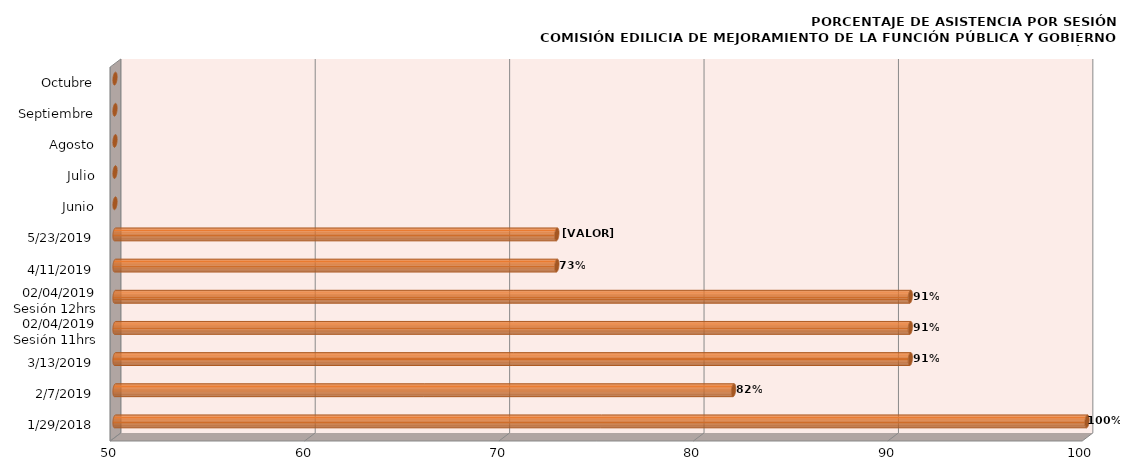
| Category | Series 0 |
|---|---|
| 29/01/2018 | 100 |
| 07/02/2019 | 81.818 |
| 13/03/2019 | 90.909 |
| 02/04/2019
Sesión 11hrs | 90.909 |
| 02/04/2019
Sesión 12hrs | 90.909 |
| 11/04/2019 | 72.727 |
| 23/05/2019 | 72.727 |
| Junio | 0 |
| Julio | 0 |
| Agosto | 0 |
| Septiembre | 0 |
| Octubre | 0 |